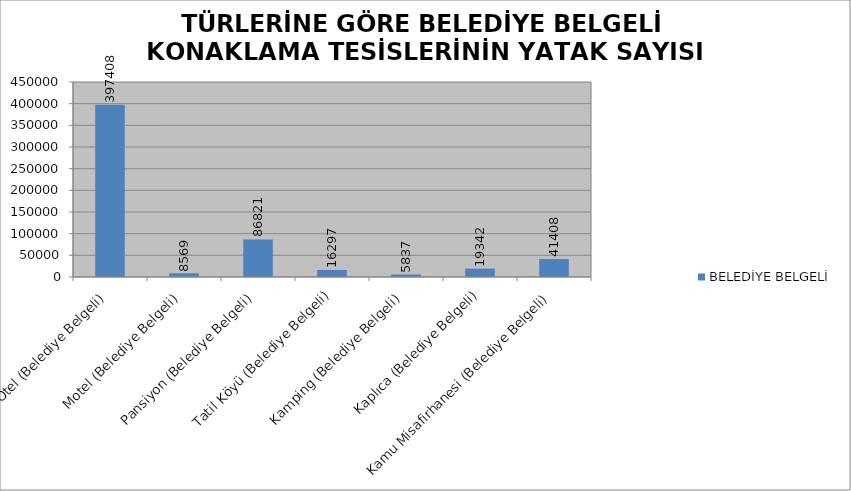
| Category | BELEDİYE BELGELİ |
|---|---|
| Otel (Belediye Belgeli) | 397408 |
| Motel (Belediye Belgeli) | 8569 |
| Pansiyon (Belediye Belgeli) | 86821 |
| Tatil Köyü (Belediye Belgeli) | 16297 |
| Kamping (Belediye Belgeli) | 5837 |
| Kaplıca (Belediye Belgeli) | 19342 |
| Kamu Misafirhanesi (Belediye Belgeli) | 41408 |